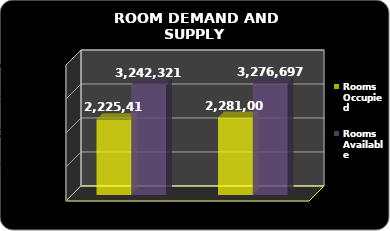
| Category | Rooms Occupied | Rooms Available |
|---|---|---|
| 2016.0 | 2281005 | 3276697 |
| 2015.0 | 2225412 | 3242321 |